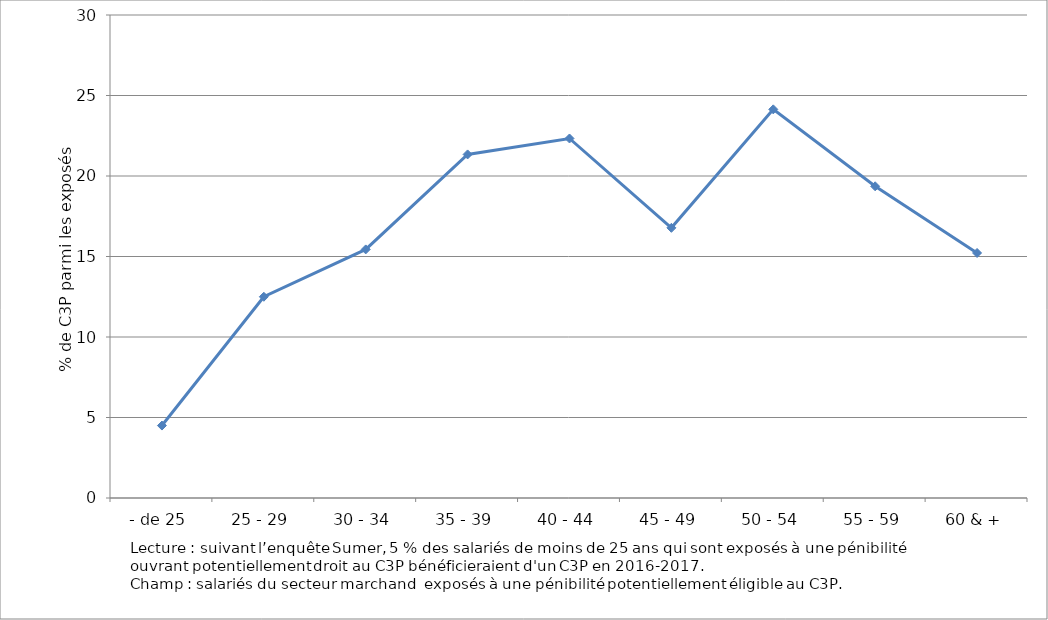
| Category | Series 0 |
|---|---|
| - de 25 | 4.5 |
| 25 - 29 | 12.5 |
| 30 - 34 | 15.44 |
| 35 - 39 | 21.34 |
| 40 - 44 | 22.33 |
| 45 - 49 | 16.78 |
| 50 - 54 | 24.14 |
| 55 - 59 | 19.36 |
| 60 & + | 15.22 |